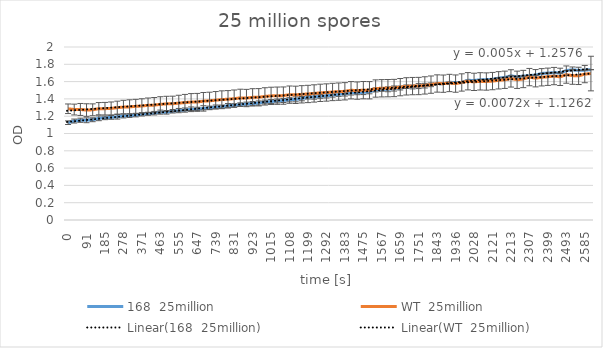
| Category | 168  25million | WT  25million |
|---|---|---|
| 0.0 | 1.125 | 1.286 |
| 30.0 | 1.144 | 1.277 |
| 61.0 | 1.153 | 1.278 |
| 91.0 | 1.153 | 1.271 |
| 122.0 | 1.159 | 1.274 |
| 153.0 | 1.176 | 1.287 |
| 185.0 | 1.181 | 1.287 |
| 216.0 | 1.186 | 1.29 |
| 246.0 | 1.193 | 1.299 |
| 278.0 | 1.203 | 1.305 |
| 309.0 | 1.207 | 1.308 |
| 341.0 | 1.211 | 1.314 |
| 371.0 | 1.222 | 1.318 |
| 402.0 | 1.228 | 1.326 |
| 432.0 | 1.235 | 1.328 |
| 463.0 | 1.247 | 1.337 |
| 494.0 | 1.245 | 1.343 |
| 525.0 | 1.257 | 1.344 |
| 555.0 | 1.265 | 1.351 |
| 586.0 | 1.271 | 1.358 |
| 617.0 | 1.28 | 1.363 |
| 647.0 | 1.28 | 1.364 |
| 678.0 | 1.29 | 1.374 |
| 708.0 | 1.296 | 1.378 |
| 739.0 | 1.307 | 1.385 |
| 770.0 | 1.308 | 1.393 |
| 800.0 | 1.322 | 1.396 |
| 831.0 | 1.325 | 1.403 |
| 862.0 | 1.335 | 1.412 |
| 893.0 | 1.34 | 1.41 |
| 923.0 | 1.346 | 1.418 |
| 954.0 | 1.352 | 1.419 |
| 985.0 | 1.364 | 1.429 |
| 1015.0 | 1.369 | 1.435 |
| 1046.0 | 1.376 | 1.437 |
| 1076.0 | 1.382 | 1.438 |
| 1108.0 | 1.39 | 1.449 |
| 1139.0 | 1.395 | 1.447 |
| 1169.0 | 1.403 | 1.453 |
| 1199.0 | 1.42 | 1.457 |
| 1230.0 | 1.423 | 1.463 |
| 1261.0 | 1.429 | 1.47 |
| 1292.0 | 1.436 | 1.474 |
| 1323.0 | 1.444 | 1.48 |
| 1353.0 | 1.453 | 1.484 |
| 1383.0 | 1.46 | 1.488 |
| 1414.0 | 1.47 | 1.5 |
| 1444.0 | 1.473 | 1.496 |
| 1475.0 | 1.475 | 1.501 |
| 1505.0 | 1.481 | 1.5 |
| 1536.0 | 1.504 | 1.52 |
| 1567.0 | 1.509 | 1.523 |
| 1598.0 | 1.511 | 1.524 |
| 1629.0 | 1.52 | 1.526 |
| 1659.0 | 1.526 | 1.536 |
| 1690.0 | 1.541 | 1.545 |
| 1720.0 | 1.538 | 1.548 |
| 1751.0 | 1.548 | 1.549 |
| 1782.0 | 1.553 | 1.556 |
| 1813.0 | 1.563 | 1.565 |
| 1843.0 | 1.577 | 1.578 |
| 1874.0 | 1.576 | 1.576 |
| 1905.0 | 1.592 | 1.584 |
| 1936.0 | 1.589 | 1.577 |
| 1967.0 | 1.591 | 1.59 |
| 1997.0 | 1.615 | 1.604 |
| 2028.0 | 1.613 | 1.597 |
| 2059.0 | 1.621 | 1.603 |
| 2090.0 | 1.623 | 1.601 |
| 2121.0 | 1.626 | 1.606 |
| 2151.0 | 1.641 | 1.615 |
| 2182.0 | 1.648 | 1.621 |
| 2213.0 | 1.667 | 1.637 |
| 2244.0 | 1.655 | 1.621 |
| 2276.0 | 1.664 | 1.63 |
| 2307.0 | 1.669 | 1.652 |
| 2337.0 | 1.675 | 1.639 |
| 2368.0 | 1.694 | 1.65 |
| 2399.0 | 1.699 | 1.656 |
| 2431.0 | 1.703 | 1.664 |
| 2462.0 | 1.699 | 1.655 |
| 2493.0 | 1.728 | 1.681 |
| 2523.0 | 1.737 | 1.669 |
| 2554.0 | 1.729 | 1.666 |
| 2585.0 | 1.733 | 1.687 |
| 2616.0 | 1.738 | 1.693 |